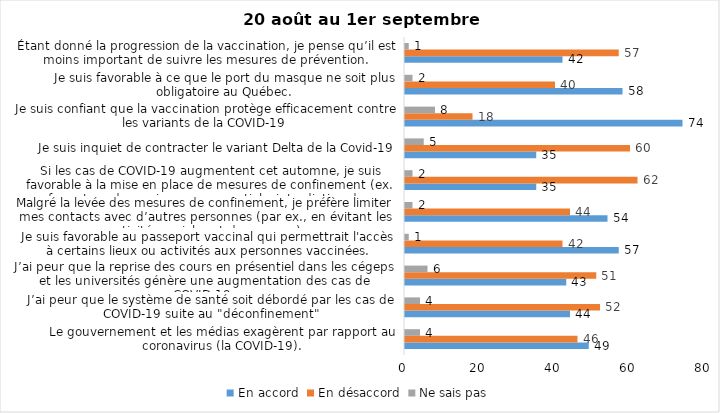
| Category | En accord | En désaccord | Ne sais pas |
|---|---|---|---|
| Le gouvernement et les médias exagèrent par rapport au coronavirus (la COVID-19). | 49 | 46 | 4 |
| J’ai peur que le système de santé soit débordé par les cas de COVID-19 suite au "déconfinement" | 44 | 52 | 4 |
| J’ai peur que la reprise des cours en présentiel dans les cégeps et les universités génère une augmentation des cas de COVID-19. | 43 | 51 | 6 |
| Je suis favorable au passeport vaccinal qui permettrait l'accès à certains lieux ou activités aux personnes vaccinées. | 57 | 42 | 1 |
| Malgré la levée des mesures de confinement, je préfère limiter mes contacts avec d’autres personnes (par ex., en évitant les activités sociales et de groupes) | 54 | 44 | 2 |
| Si les cas de COVID-19 augmentent cet automne, je suis favorable à la mise en place de mesures de confinement (ex. fermeture de services non essentiels, interdiction des rassemblements privés) | 35 | 62 | 2 |
| Je suis inquiet de contracter le variant Delta de la Covid-19 | 35 | 60 | 5 |
| Je suis confiant que la vaccination protège efficacement contre les variants de la COVID-19 | 74 | 18 | 8 |
| Je suis favorable à ce que le port du masque ne soit plus obligatoire au Québec. | 58 | 40 | 2 |
| Étant donné la progression de la vaccination, je pense qu’il est moins important de suivre les mesures de prévention. | 42 | 57 | 1 |